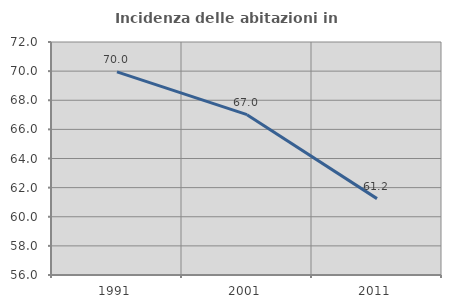
| Category | Incidenza delle abitazioni in proprietà  |
|---|---|
| 1991.0 | 69.951 |
| 2001.0 | 67.01 |
| 2011.0 | 61.244 |